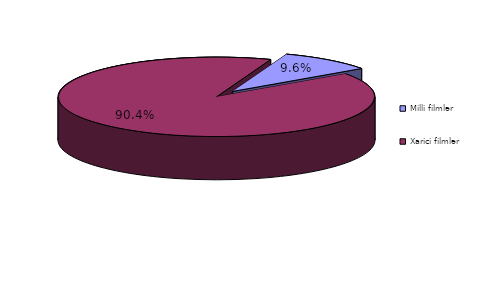
| Category | Series 0 |
|---|---|
| Milli filmlər  | 60 |
| Xarici filmlər  | 563 |